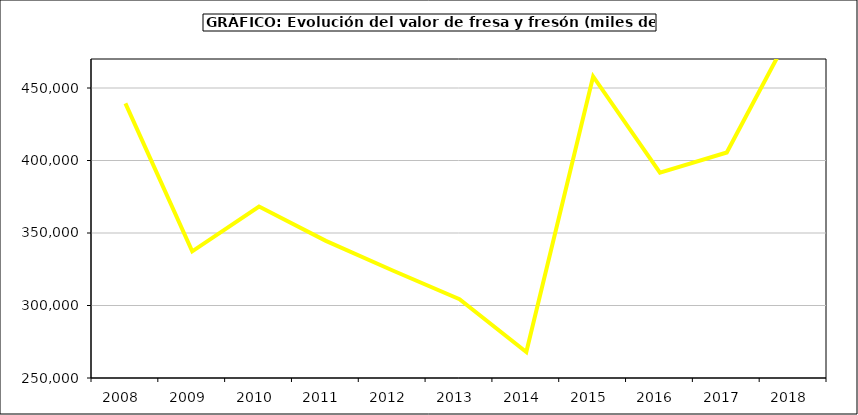
| Category | Valor |
|---|---|
| 2008.0 | 439353.128 |
| 2009.0 | 337386.548 |
| 2010.0 | 368287.313 |
| 2011.0 | 344604.077 |
| 2012.0 | 324144.524 |
| 2013.0 | 304404.377 |
| 2014.0 | 267944.247 |
| 2015.0 | 457982 |
| 2016.0 | 391643 |
| 2017.0 | 405540.083 |
| 2018.0 | 492270.548 |